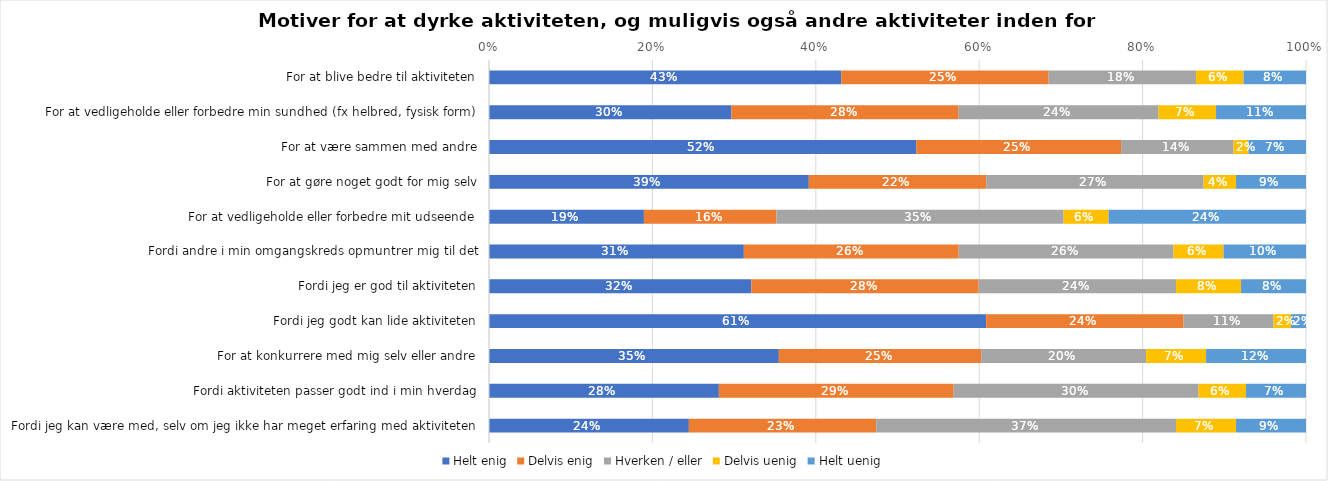
| Category | Helt enig | Delvis enig | Hverken / eller | Delvis uenig | Helt uenig |
|---|---|---|---|---|---|
| For at blive bedre til aktiviteten | 0.431 | 0.254 | 0.18 | 0.058 | 0.076 |
| For at vedligeholde eller forbedre min sundhed (fx helbred, fysisk form) | 0.297 | 0.278 | 0.245 | 0.07 | 0.11 |
| For at være sammen med andre | 0.523 | 0.251 | 0.138 | 0.018 | 0.07 |
| For at gøre noget godt for mig selv | 0.391 | 0.217 | 0.266 | 0.04 | 0.086 |
| For at vedligeholde eller forbedre mit udseende | 0.19 | 0.162 | 0.352 | 0.055 | 0.242 |
| Fordi andre i min omgangskreds opmuntrer mig til det | 0.312 | 0.263 | 0.263 | 0.061 | 0.101 |
| Fordi jeg er god til aktiviteten | 0.321 | 0.278 | 0.242 | 0.08 | 0.08 |
| Fordi jeg godt kan lide aktiviteten | 0.609 | 0.242 | 0.11 | 0.021 | 0.018 |
| For at konkurrere med mig selv eller andre | 0.355 | 0.248 | 0.202 | 0.073 | 0.122 |
| Fordi aktiviteten passer godt ind i min hverdag | 0.281 | 0.287 | 0.3 | 0.058 | 0.073 |
| Fordi jeg kan være med, selv om jeg ikke har meget erfaring med aktiviteten | 0.245 | 0.229 | 0.367 | 0.073 | 0.086 |